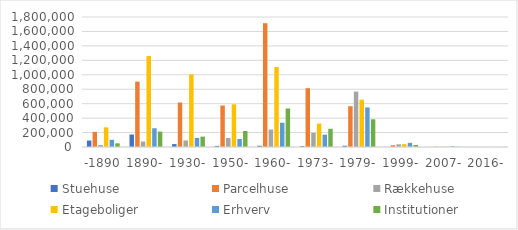
| Category | Stuehuse | Parcelhuse | Rækkehuse | Etageboliger | Erhverv | Institutioner |
|---|---|---|---|---|---|---|
| -1890 | 89255.875 | 209066.368 | 27294.795 | 271822.18 | 100427.884 | 50959.558 |
| 1890- | 172990.294 | 905283.203 | 75493.444 | 1259023.53 | 259571.288 | 213413.614 |
| 1930- | 40305.356 | 616553.963 | 90837.55 | 1005501.201 | 125715.159 | 143509.634 |
| 1950- | 15449.53 | 574773.106 | 125169.528 | 591161.248 | 110281.644 | 221686.616 |
| 1960- | 17125.752 | 1714504.347 | 241640.756 | 1108191.18 | 336250.523 | 532670.732 |
| 1973- | 12834.336 | 814264.264 | 195877.818 | 324429.15 | 170882.357 | 252267.131 |
| 1979- | 17503.316 | 564555.187 | 767429.273 | 655615.016 | 547813.839 | 383393.622 |
| 1999- | 894.78 | 24793.382 | 37563.395 | 38461.068 | 57031.745 | 27616.985 |
| 2007- | 94.68 | 4016.143 | 2181.416 | 1868.069 | 10134.111 | 2347.492 |
| 2016- | 0 | 58.1 | 0 | 32.66 | 646.452 | 64.43 |